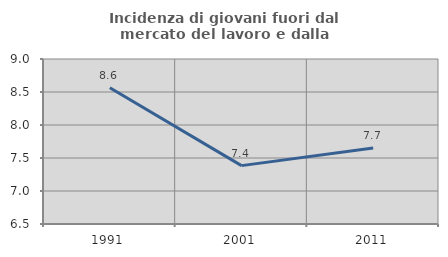
| Category | Incidenza di giovani fuori dal mercato del lavoro e dalla formazione  |
|---|---|
| 1991.0 | 8.565 |
| 2001.0 | 7.385 |
| 2011.0 | 7.65 |